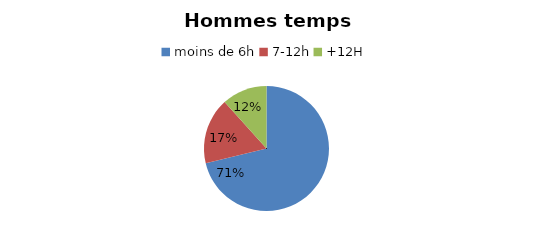
| Category | Hommes temps partiel |
|---|---|
| moins de 6h | 71.24 |
| 7-12h | 17.07 |
| +12H | 11.69 |